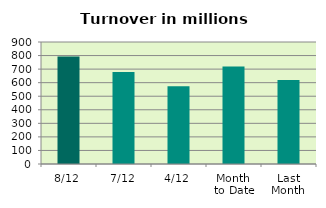
| Category | Series 0 |
|---|---|
| 8/12 | 792.979 |
| 7/12 | 678.12 |
| 4/12 | 573.028 |
| Month 
to Date | 718.757 |
| Last
Month | 619.399 |